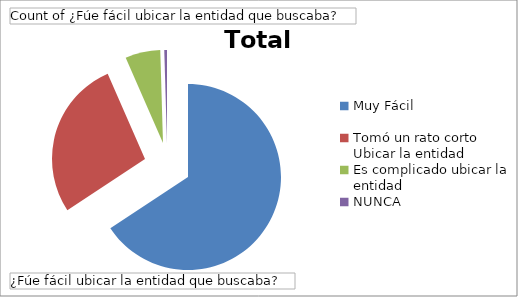
| Category | Total |
|---|---|
| Muy Fácil | 140 |
| Tomó un rato corto Ubicar la entidad | 59 |
| Es complicado ubicar la entidad | 13 |
| NUNCA | 1 |